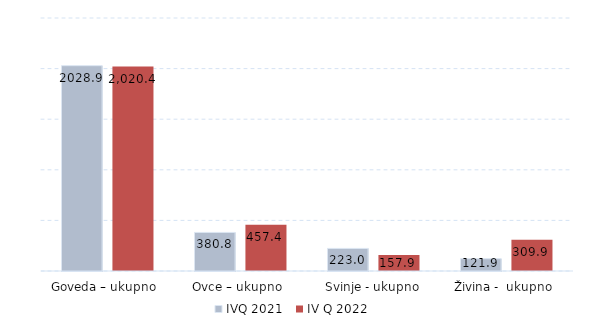
| Category | IVQ 2021 | IV Q 2022 |
|---|---|---|
| Goveda – ukupno  | 2028.923 | 2020.4 |
| Ovce – ukupno  | 380.8 | 457.4 |
| Svinje - ukupno | 222.985 | 157.9 |
| Živina -  ukupno  | 121.9 | 309.9 |